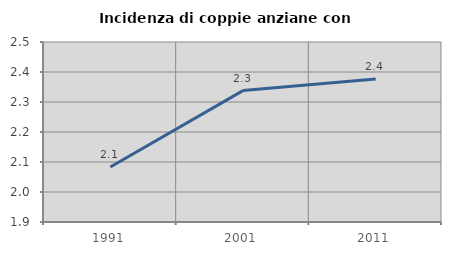
| Category | Incidenza di coppie anziane con figli |
|---|---|
| 1991.0 | 2.083 |
| 2001.0 | 2.338 |
| 2011.0 | 2.377 |